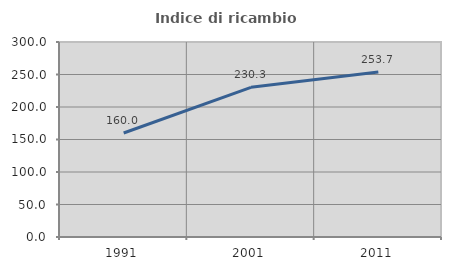
| Category | Indice di ricambio occupazionale  |
|---|---|
| 1991.0 | 160 |
| 2001.0 | 230.282 |
| 2011.0 | 253.731 |